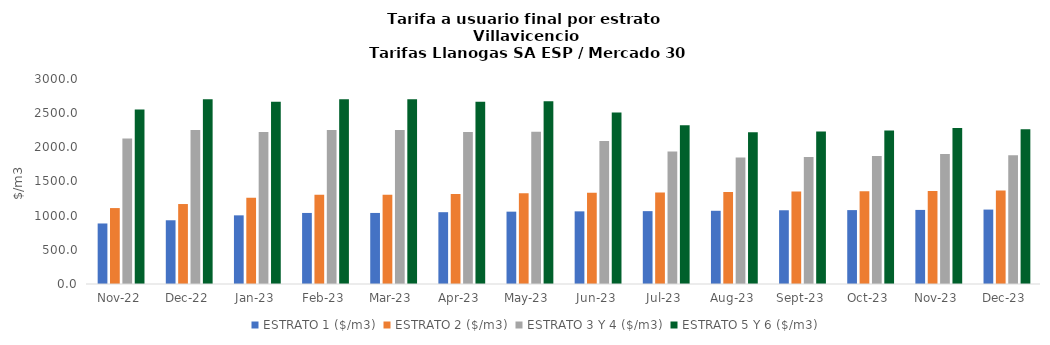
| Category | ESTRATO 1 ($/m3) | ESTRATO 2 ($/m3) | ESTRATO 3 Y 4 ($/m3) | ESTRATO 5 Y 6 ($/m3) |
|---|---|---|---|---|
| 2022-11-01 | 885.71 | 1111.19 | 2128.04 | 2553.648 |
| 2022-12-01 | 932.64 | 1170.28 | 2251.92 | 2702.304 |
| 2023-01-01 | 1004.76 | 1260.83 | 2223.64 | 2668.368 |
| 2023-02-01 | 1039.76 | 1304.76 | 2251.92 | 2702.304 |
| 2023-03-01 | 1039.76 | 1304.76 | 2251.92 | 2702.304 |
| 2023-04-01 | 1050.8 | 1318.62 | 2223.64 | 2668.368 |
| 2023-05-01 | 1058.67 | 1328.49 | 2227.49 | 2672.988 |
| 2023-06-01 | 1063.04 | 1333.97 | 2092.35 | 2510.82 |
| 2023-07-01 | 1066.3 | 1338.06 | 1937.39 | 2324.868 |
| 2023-08-01 | 1071.54 | 1344.64 | 1852.08 | 2222.496 |
| 2023-09-01 | 1079.09 | 1354.11 | 1858.9 | 2230.68 |
| 2023-10-01 | 1081.39 | 1357 | 1871.96 | 2246.352 |
| 2023-11-01 | 1084.09 | 1360.39 | 1903.33 | 2283.996 |
| 2023-12-01 | 1089.17 | 1366.77 | 1885.93 | 2263.116 |